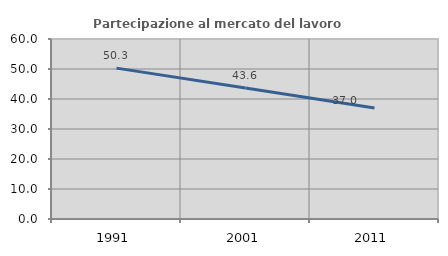
| Category | Partecipazione al mercato del lavoro  femminile |
|---|---|
| 1991.0 | 50.292 |
| 2001.0 | 43.645 |
| 2011.0 | 37.006 |